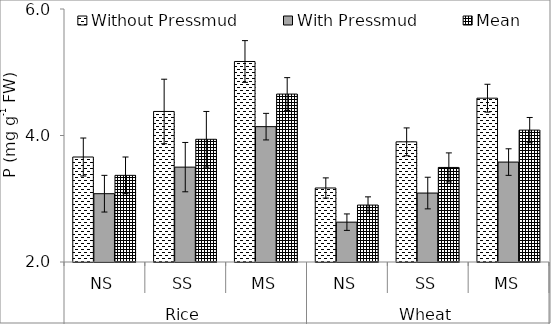
| Category | Without Pressmud | With Pressmud | Mean |
|---|---|---|---|
| 0 | 3.66 | 3.08 | 3.37 |
| 1 | 4.38 | 3.5 | 3.94 |
| 2 | 5.17 | 4.14 | 4.655 |
| 3 | 3.17 | 2.63 | 2.9 |
| 4 | 3.9 | 3.09 | 3.495 |
| 5 | 4.59 | 3.58 | 4.085 |